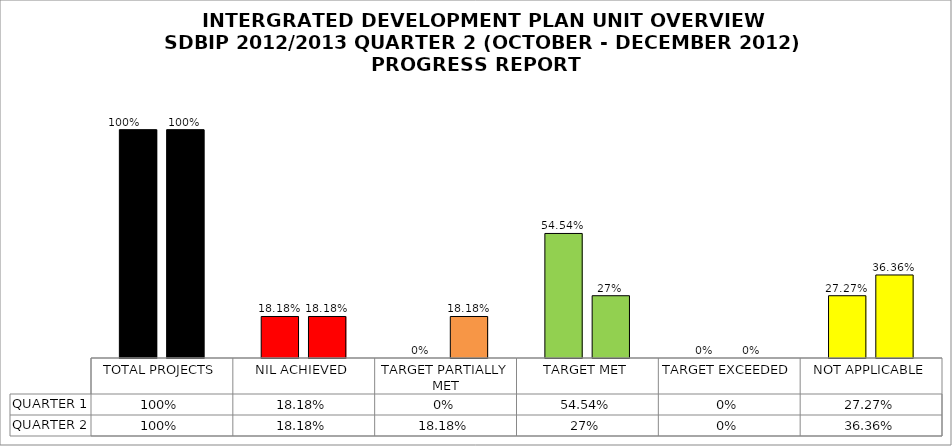
| Category | QUARTER 1 | QUARTER 2 |
|---|---|---|
| TOTAL PROJECTS | 1 | 1 |
| NIL ACHIEVED | 0.182 | 0.182 |
| TARGET PARTIALLY MET | 0 | 0.182 |
| TARGET MET | 0.545 | 0.273 |
| TARGET EXCEEDED | 0 | 0 |
| NOT APPLICABLE | 0.273 | 0.364 |